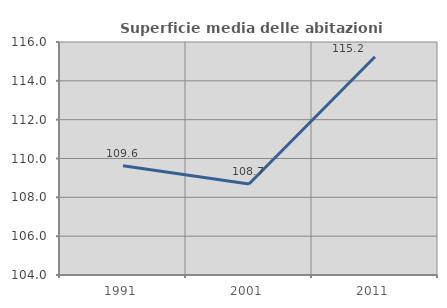
| Category | Superficie media delle abitazioni occupate |
|---|---|
| 1991.0 | 109.629 |
| 2001.0 | 108.686 |
| 2011.0 | 115.241 |